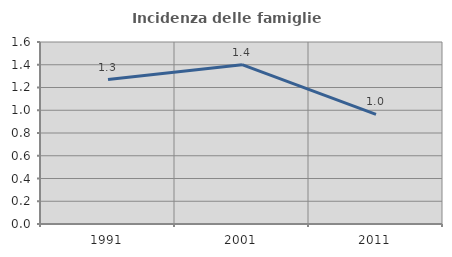
| Category | Incidenza delle famiglie numerose |
|---|---|
| 1991.0 | 1.27 |
| 2001.0 | 1.401 |
| 2011.0 | 0.964 |